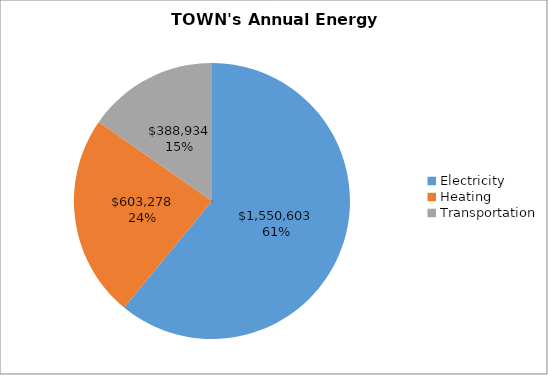
| Category | Series 1 | Series 0 |
|---|---|---|
| Electricity | 1550602.609 | 1550602.609 |
| Heating | 603278.491 | 603278.491 |
| Transportation | 388933.939 | 388933.939 |